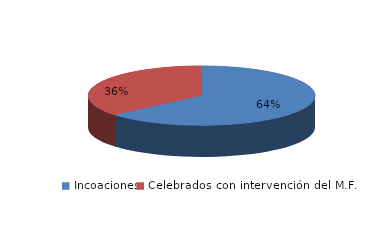
| Category | Series 0 |
|---|---|
| Incoaciones | 1401 |
| Celebrados con intervención del M.F. | 796 |